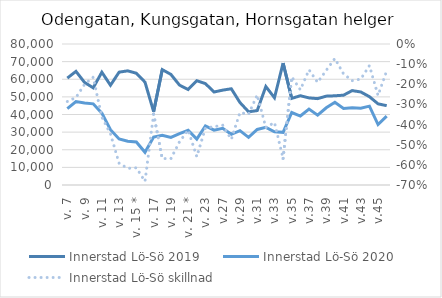
| Category | Innerstad |
|---|---|
| v. 7 | 43337 |
| v. 8 | 47346.5 |
| v. 9 | 46545.5 |
| v. 10 | 46045 |
| v. 11 | 40768.5 |
| v. 12 | 31353 |
| v. 13 | 26107.5 |
| v. 14 | 24793.5 |
| v. 15 * | 24435 |
| v. 16 * | 18552.92 |
| v. 17 | 27165.801 |
| v. 18 * | 28228.906 |
| v. 19 | 27031.313 |
| v. 20 | 29149.017 |
| v. 21 * | 31042.668 |
| v. 22 * | 26093.879 |
| v. 23 | 33517.139 |
| v. 24 | 31121.134 |
| v.27 | 32123.378 |
| v.28 | 28758.043 |
| v.29 | 30863.132 |
| v.30 | 27050.811 |
| v.31 | 31535.976 |
| v.32 | 32694.816 |
| v.33 | 30200.489 |
| v.34 | 29884.265 |
| v.35 | 41128.354 |
| v.36 | 39133.96 |
| v.37 | 43089.926 |
| v.38 | 39655.752 |
| v.39 | 43828.592 |
| v.40 | 46977.922 |
| v.41 | 43410.013 |
| v.42 | 43811.466 |
| v.43 | 43590.597 |
| v.44 | 44740.196 |
| v.45 | 34283.841 |